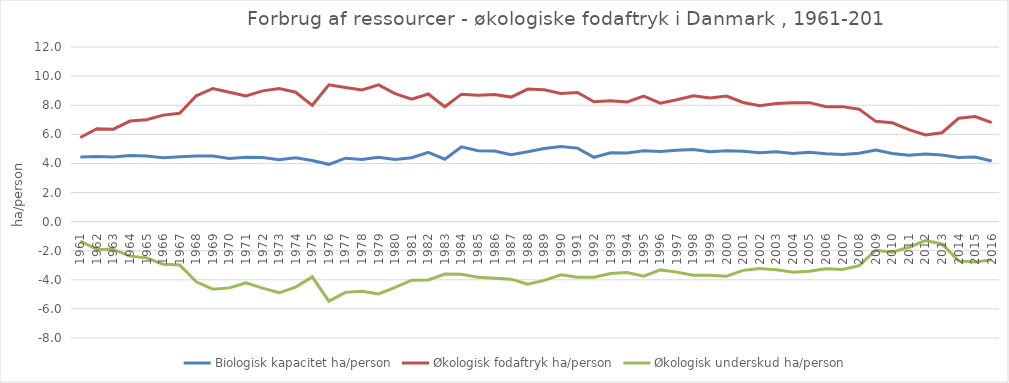
| Category | Biologisk kapacitet ha/person | Økologisk fodaftryk ha/person | Økologisk underskud ha/person |
|---|---|---|---|
| 1961.0 | 4.445 | 5.781 | -1.336 |
| 1962.0 | 4.478 | 6.387 | -1.908 |
| 1963.0 | 4.436 | 6.351 | -1.915 |
| 1964.0 | 4.536 | 6.911 | -2.375 |
| 1965.0 | 4.514 | 7.006 | -2.492 |
| 1966.0 | 4.393 | 7.319 | -2.925 |
| 1967.0 | 4.455 | 7.444 | -2.988 |
| 1968.0 | 4.502 | 8.644 | -4.142 |
| 1969.0 | 4.505 | 9.151 | -4.645 |
| 1970.0 | 4.331 | 8.886 | -4.555 |
| 1971.0 | 4.43 | 8.629 | -4.2 |
| 1972.0 | 4.41 | 8.986 | -4.576 |
| 1973.0 | 4.254 | 9.147 | -4.894 |
| 1974.0 | 4.393 | 8.892 | -4.499 |
| 1975.0 | 4.194 | 7.993 | -3.799 |
| 1976.0 | 3.936 | 9.405 | -5.469 |
| 1977.0 | 4.36 | 9.223 | -4.863 |
| 1978.0 | 4.262 | 9.042 | -4.78 |
| 1979.0 | 4.429 | 9.401 | -4.972 |
| 1980.0 | 4.276 | 8.801 | -4.525 |
| 1981.0 | 4.392 | 8.42 | -4.028 |
| 1982.0 | 4.761 | 8.767 | -4.006 |
| 1983.0 | 4.286 | 7.892 | -3.606 |
| 1984.0 | 5.138 | 8.758 | -3.62 |
| 1985.0 | 4.87 | 8.687 | -3.818 |
| 1986.0 | 4.847 | 8.741 | -3.894 |
| 1987.0 | 4.602 | 8.557 | -3.954 |
| 1988.0 | 4.8 | 9.109 | -4.309 |
| 1989.0 | 5.026 | 9.066 | -4.04 |
| 1990.0 | 5.158 | 8.812 | -3.654 |
| 1991.0 | 5.052 | 8.871 | -3.819 |
| 1992.0 | 4.419 | 8.24 | -3.822 |
| 1993.0 | 4.733 | 8.3 | -3.567 |
| 1994.0 | 4.723 | 8.221 | -3.498 |
| 1995.0 | 4.874 | 8.627 | -3.753 |
| 1996.0 | 4.817 | 8.137 | -3.32 |
| 1997.0 | 4.898 | 8.37 | -3.472 |
| 1998.0 | 4.95 | 8.643 | -3.693 |
| 1999.0 | 4.802 | 8.49 | -3.687 |
| 2000.0 | 4.875 | 8.624 | -3.749 |
| 2001.0 | 4.838 | 8.19 | -3.352 |
| 2002.0 | 4.729 | 7.96 | -3.23 |
| 2003.0 | 4.808 | 8.114 | -3.306 |
| 2004.0 | 4.684 | 8.171 | -3.486 |
| 2005.0 | 4.758 | 8.174 | -3.416 |
| 2006.0 | 4.664 | 7.9 | -3.236 |
| 2007.0 | 4.616 | 7.901 | -3.285 |
| 2008.0 | 4.697 | 7.728 | -3.03 |
| 2009.0 | 4.923 | 6.89 | -1.967 |
| 2010.0 | 4.685 | 6.791 | -2.106 |
| 2011.0 | 4.559 | 6.321 | -1.762 |
| 2012.0 | 4.646 | 5.949 | -1.303 |
| 2013.0 | 4.574 | 6.108 | -1.535 |
| 2014.0 | 4.4 | 7.1 | -2.7 |
| 2015.0 | 4.44 | 7.22 | -2.78 |
| 2016.0 | 4.17 | 6.8 | -2.63 |